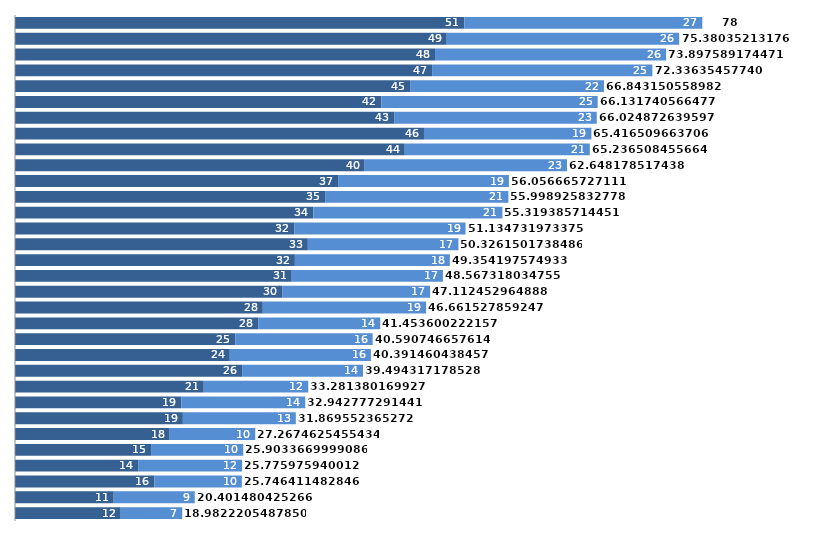
| Category | Balken1 | Blaken2 | Balken3leer |
|---|---|---|---|
| 0 | 12 | 6.982 | 4 |
| 1 | 11.202 | 9.2 | 4 |
| 2 | 15.818 | 9.928 | 4 |
| 3 | 13.979 | 11.797 | 4 |
| 4 | 15.445 | 10.459 | 4 |
| 5 | 17.558 | 9.71 | 4 |
| 6 | 19.052 | 12.817 | 4 |
| 7 | 18.869 | 14.074 | 4 |
| 8 | 21.423 | 11.859 | 4 |
| 9 | 25.775 | 13.719 | 4 |
| 10 | 24.378 | 16.013 | 4 |
| 11 | 25 | 15.591 | 4 |
| 12 | 27.633 | 13.821 | 4 |
| 13 | 28.122 | 18.539 | 4 |
| 14 | 30.318 | 16.794 | 4 |
| 15 | 31.405 | 17.162 | 4 |
| 16 | 31.766 | 17.588 | 4 |
| 17 | 33.237 | 17.089 | 4 |
| 18 | 31.688 | 19.447 | 4 |
| 19 | 33.859 | 21.46 | 4 |
| 20 | 35.196 | 20.803 | 4 |
| 21 | 36.671 | 19.386 | 4 |
| 22 | 39.685 | 22.963 | 4 |
| 23 | 44.237 | 21 | 4 |
| 24 | 46.417 | 19 | 4 |
| 25 | 43.03 | 22.995 | 4 |
| 26 | 41.584 | 24.548 | 4 |
| 27 | 44.843 | 22 | 4 |
| 28 | 47.336 | 25 | 4 |
| 29 | 47.673 | 26.225 | 4 |
| 30 | 49 | 26.38 | 4 |
| 31 | 51 | 27 | 4 |